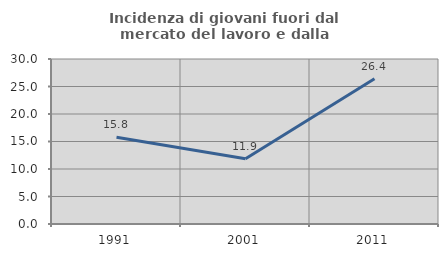
| Category | Incidenza di giovani fuori dal mercato del lavoro e dalla formazione  |
|---|---|
| 1991.0 | 15.789 |
| 2001.0 | 11.875 |
| 2011.0 | 26.404 |